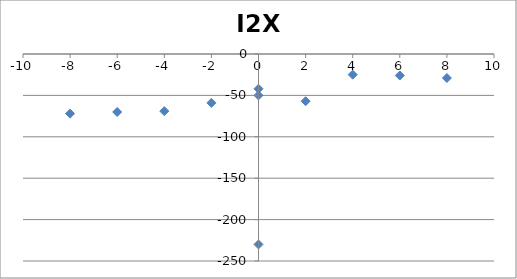
| Category | I2X |
|---|---|
| 0.0 | -230 |
| 2.0 | -57 |
| 4.0 | -25 |
| 6.0 | -26 |
| 8.0 | -29 |
| 0.0 | -50 |
| -2.0 | -59 |
| -4.0 | -69 |
| -6.0 | -70 |
| -8.0 | -72 |
| 0.0 | -42 |